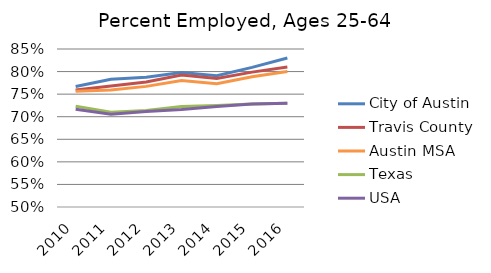
| Category | City of Austin | Travis County | Austin MSA | Texas | USA |
|---|---|---|---|---|---|
| 2010.0 | 0.767 | 0.759 | 0.756 | 0.723 | 0.716 |
| 2011.0 | 0.783 | 0.768 | 0.759 | 0.71 | 0.705 |
| 2012.0 | 0.788 | 0.777 | 0.767 | 0.714 | 0.712 |
| 2013.0 | 0.798 | 0.792 | 0.78 | 0.723 | 0.716 |
| 2014.0 | 0.791 | 0.785 | 0.773 | 0.725 | 0.723 |
| 2015.0 | 0.809 | 0.799 | 0.788 | 0.728 | 0.728 |
| 2016.0 | 0.83 | 0.81 | 0.8 | 0.73 | 0.73 |